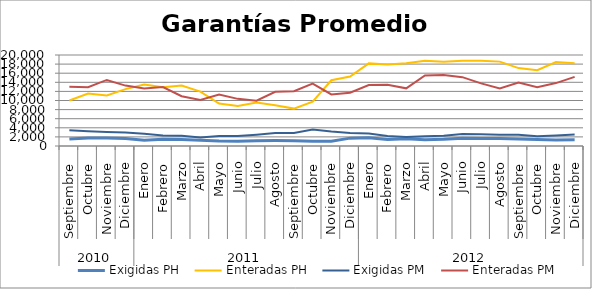
| Category | Exigidas PH | Enteradas PH | Exigidas PM | Enteradas PM |
|---|---|---|---|---|
| 0 | 1528.048 | 9989.528 | 3482.397 | 13040.893 |
| 1 | 1765.671 | 11522.563 | 3249.678 | 12931.878 |
| 2 | 1744.818 | 11123.372 | 3083.204 | 14519.409 |
| 3 | 1659.203 | 12493.623 | 2971.808 | 13273.812 |
| 4 | 1282.931 | 13511.197 | 2715.795 | 12631.271 |
| 5 | 1469.886 | 12912.935 | 2313.398 | 12967.84 |
| 6 | 1451.049 | 13292.147 | 2234.5 | 10944.124 |
| 7 | 1243.266 | 11940.059 | 1876.192 | 10106.188 |
| 8 | 1094.477 | 9346.935 | 2211.516 | 11309.35 |
| 9 | 1038.181 | 8772.488 | 2185.859 | 10360.845 |
| 10 | 1150.33 | 9583.522 | 2484.933 | 9954.534 |
| 11 | 1204.945 | 8947.225 | 2874.347 | 11912.953 |
| 12 | 1181.135 | 8218.837 | 2868.226 | 12046.458 |
| 13 | 1047.181 | 9725.758 | 3619.145 | 13704.352 |
| 14 | 1067.214 | 14456.861 | 3177.175 | 11327.495 |
| 15 | 1729.716 | 15271.717 | 2830.669 | 11719.895 |
| 16 | 1828.564 | 18155.583 | 2744.93 | 13413.991 |
| 17 | 1451.155 | 17917.734 | 2215.902 | 13440.832 |
| 18 | 1587.31 | 18166.129 | 1968.766 | 12673.714 |
| 19 | 1353.003 | 18741.256 | 2118.782 | 15515.723 |
| 20 | 1464.668 | 18540.927 | 2278.002 | 15625.393 |
| 21 | 1719.43 | 18734.539 | 2626.915 | 15127.903 |
| 22 | 1674.023 | 18761.463 | 2556.575 | 13766.49 |
| 23 | 1647.243 | 18544.546 | 2463.76 | 12637.427 |
| 24 | 1556.152 | 17124.972 | 2459.803 | 13929.715 |
| 25 | 1402.926 | 16653.067 | 2169.047 | 12937.81 |
| 26 | 1329.011 | 18467.462 | 2322.009 | 13825.53 |
| 27 | 1379.519 | 18204.98 | 2522.413 | 15188.776 |